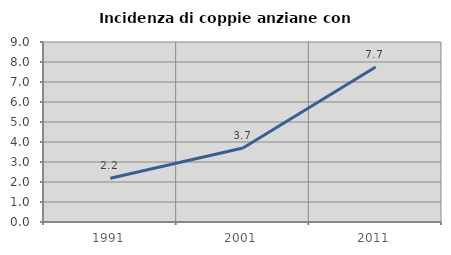
| Category | Incidenza di coppie anziane con figli |
|---|---|
| 1991.0 | 2.19 |
| 2001.0 | 3.704 |
| 2011.0 | 7.746 |